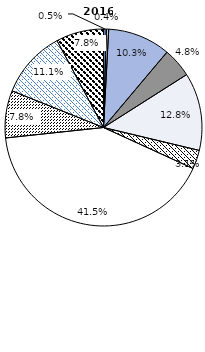
| Category | 2016 |
|---|---|
| Huile/graisse/cire animale/végétale | 0.463 |
| Boissons et tabac | 0.384 |
| Produits chimiques | 10.295 |
| Produits de base | 4.843 |
| Matières premières (hors alimentation et carburants) | 12.755 |
| Alimentation et bétail | 3.096 |
| Machineries et équipements de transport | 41.469 |
| Produits manufacturés | 7.761 |
| Carburants minéraux et lubrifiants | 11.117 |
| Articles manufacturés divers | 7.819 |